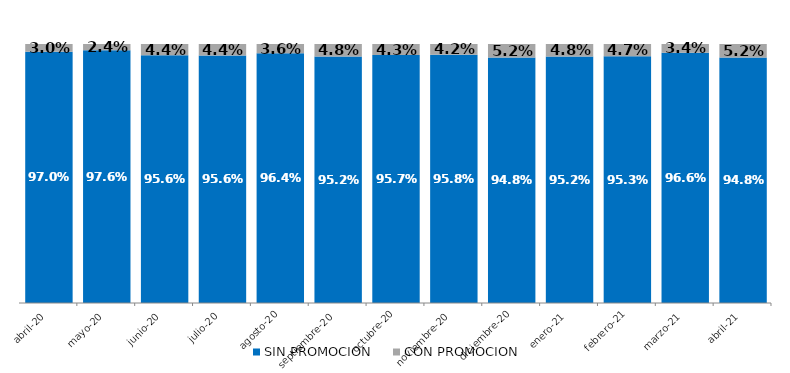
| Category | SIN PROMOCION   | CON PROMOCION   |
|---|---|---|
| 2020-04-01 | 0.97 | 0.03 |
| 2020-05-01 | 0.976 | 0.024 |
| 2020-06-01 | 0.956 | 0.044 |
| 2020-07-01 | 0.956 | 0.044 |
| 2020-08-01 | 0.964 | 0.036 |
| 2020-09-01 | 0.952 | 0.048 |
| 2020-10-01 | 0.957 | 0.043 |
| 2020-11-01 | 0.958 | 0.042 |
| 2020-12-01 | 0.948 | 0.052 |
| 2021-01-01 | 0.952 | 0.048 |
| 2021-02-01 | 0.953 | 0.047 |
| 2021-03-01 | 0.966 | 0.034 |
| 2021-04-01 | 0.948 | 0.052 |